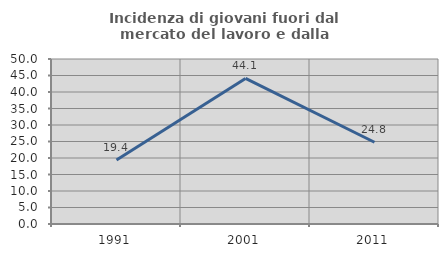
| Category | Incidenza di giovani fuori dal mercato del lavoro e dalla formazione  |
|---|---|
| 1991.0 | 19.381 |
| 2001.0 | 44.118 |
| 2011.0 | 24.782 |